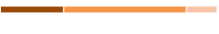
| Category | Series 0 | Series 1 | Series 2 |
|---|---|---|---|
| 0 | 0.292 | 0.566 | 0.142 |